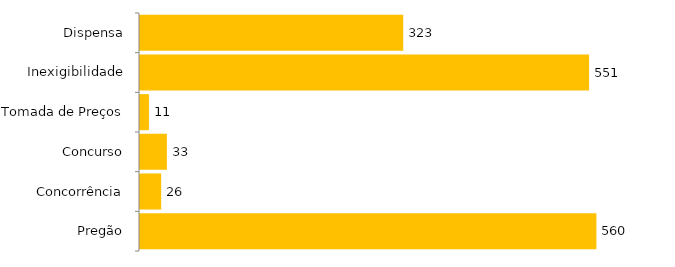
| Category | Total |
|---|---|
| Pregão | 560 |
| Concorrência | 26 |
| Concurso | 33 |
| Tomada de Preços | 11 |
| Inexigibilidade | 551 |
| Dispensa | 323 |